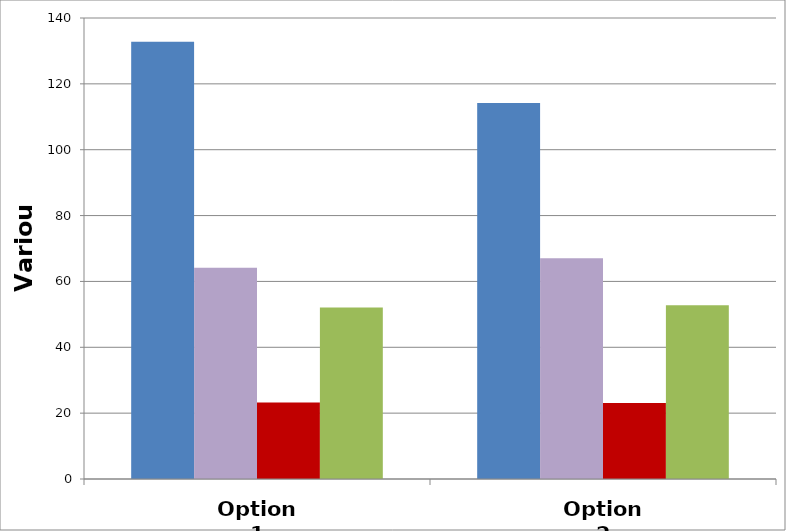
| Category | Fish | Power | Flood Cont | Irrigation |
|---|---|---|---|---|
| Option 1 | 132.755 | 64.158 | 23.216 | 52.056 |
| Option 2 | 114.189 | 67.043 | 23.057 | 52.784 |